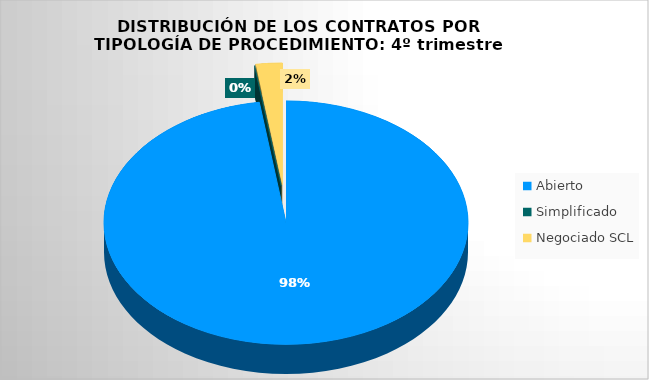
| Category | Importe adjudicado | Porcentaje |
|---|---|---|
| Abierto  | 952975.49 | 0.977 |
| Simplificado | 0 | 0 |
| Negociado SCL | 22913.1 | 0.023 |